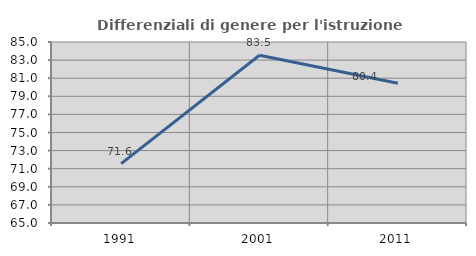
| Category | Differenziali di genere per l'istruzione superiore |
|---|---|
| 1991.0 | 71.556 |
| 2001.0 | 83.537 |
| 2011.0 | 80.433 |